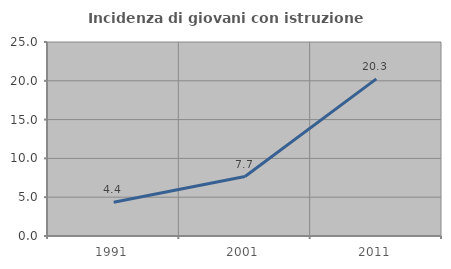
| Category | Incidenza di giovani con istruzione universitaria |
|---|---|
| 1991.0 | 4.353 |
| 2001.0 | 7.66 |
| 2011.0 | 20.251 |